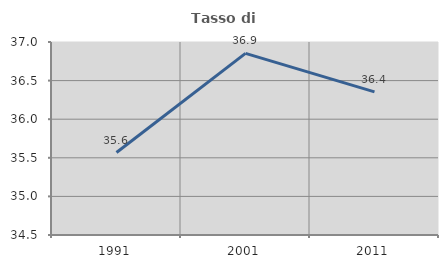
| Category | Tasso di occupazione   |
|---|---|
| 1991.0 | 35.568 |
| 2001.0 | 36.853 |
| 2011.0 | 36.353 |